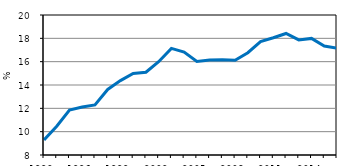
| Category | Series 1 | Series 0 |
|---|---|---|
| 1993.0 | 1993 | 9.298 |
| 1994.0 | 1994 | 10.464 |
| 1995.0 | 1995 | 11.856 |
| 1996.0 | 1996 | 12.115 |
| 1997.0 | 1997 | 12.297 |
| 1998.0 | 1998 | 13.618 |
| 1999.0 | 1999 | 14.374 |
| 2000.0 | 2000 | 14.982 |
| 2001.0 | 2001 | 15.093 |
| 2002.0 | 2002 | 15.993 |
| 2003.0 | 2003 | 17.136 |
| 2004.0 | 2004 | 16.824 |
| 2005.0 | 2005 | 16.02 |
| 2006.0 | 2006 | 16.138 |
| 2007.0 | 2007 | 16.172 |
| 2008.0 | 2008 | 16.122 |
| 2009.0 | 2009 | 16.767 |
| 2010.0 | 2010 | 17.725 |
| 2011.0 | 2011 | 18.051 |
| 2012.0 | 2012 | 18.416 |
| 2013.0 | 2013 | 17.863 |
| 2014.0 | 2014 | 17.993 |
| 2015.0 | 2015 | 17.339 |
| 2016.0 | 2016 | 17.159 |